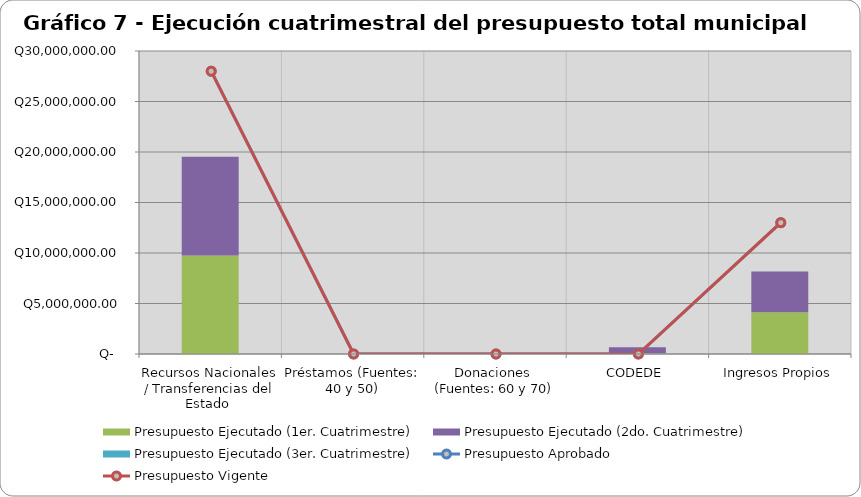
| Category | Presupuesto Ejecutado (1er. Cuatrimestre) | Presupuesto Ejecutado (2do. Cuatrimestre) | Presupuesto Ejecutado (3er. Cuatrimestre) |
|---|---|---|---|
| Recursos Nacionales / Transferencias del Estado  | 9747643.68 | 9776069.66 | 0 |
| Préstamos (Fuentes: 40 y 50) | 0 | 0 | 0 |
| Donaciones  (Fuentes: 60 y 70) | 0 | 0 | 0 |
| CODEDE | 69338.68 | 599130.6 | 0 |
| Ingresos Propios | 4128540.92 | 4036230.13 | 0 |